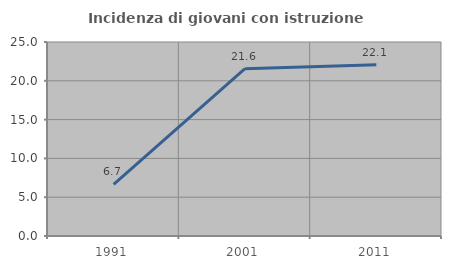
| Category | Incidenza di giovani con istruzione universitaria |
|---|---|
| 1991.0 | 6.667 |
| 2001.0 | 21.569 |
| 2011.0 | 22.059 |